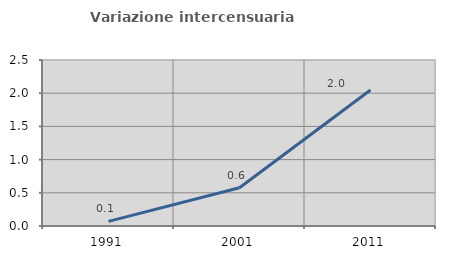
| Category | Variazione intercensuaria annua |
|---|---|
| 1991.0 | 0.069 |
| 2001.0 | 0.576 |
| 2011.0 | 2.047 |